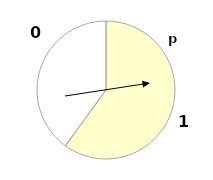
| Category | Series 0 |
|---|---|
| 1.0 | 0.6 |
| 0.0 | 0.4 |